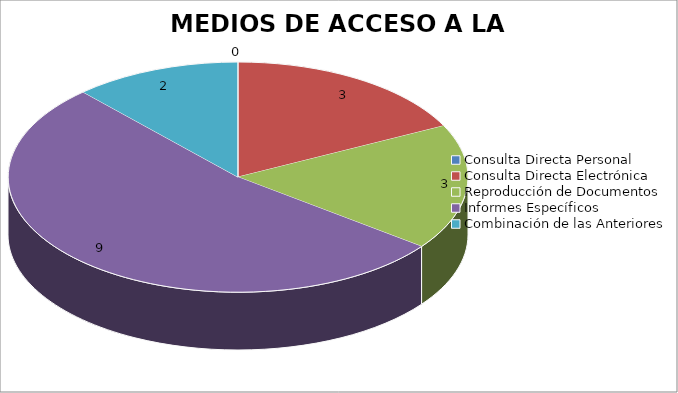
| Category | MEDIOS DE ACCESO A LA INFORMACIÓN |
|---|---|
| 0 | 0 |
| 1 | 3 |
| 2 | 3 |
| 3 | 9 |
| 4 | 2 |